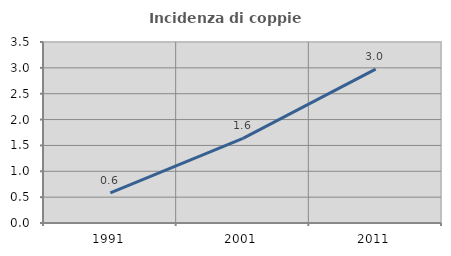
| Category | Incidenza di coppie miste |
|---|---|
| 1991.0 | 0.58 |
| 2001.0 | 1.637 |
| 2011.0 | 2.975 |